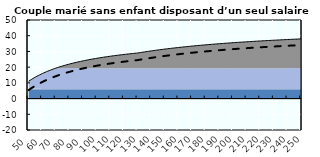
| Category | Coin fiscal moyen (somme des composantes) | Taux moyen d'imposition net en % du salaire brut |
|---|---|---|
| 50.0 | 11.048 | 5.4 |
| 51.0 | 11.62 | 6.008 |
| 52.0 | 12.17 | 6.593 |
| 53.0 | 12.7 | 7.156 |
| 54.0 | 13.209 | 7.698 |
| 55.0 | 13.701 | 8.221 |
| 56.0 | 14.174 | 8.724 |
| 57.0 | 14.631 | 9.211 |
| 58.0 | 15.073 | 9.68 |
| 59.0 | 15.499 | 10.133 |
| 60.0 | 15.911 | 10.572 |
| 61.0 | 16.31 | 10.996 |
| 62.0 | 16.696 | 11.406 |
| 63.0 | 17.069 | 11.803 |
| 64.0 | 17.431 | 12.188 |
| 65.0 | 17.782 | 12.561 |
| 66.0 | 18.122 | 12.923 |
| 67.0 | 18.452 | 13.273 |
| 68.0 | 18.772 | 13.614 |
| 69.0 | 19.083 | 13.945 |
| 70.0 | 19.385 | 14.266 |
| 71.0 | 19.679 | 14.578 |
| 72.0 | 19.964 | 14.882 |
| 73.0 | 20.242 | 15.177 |
| 74.0 | 20.512 | 15.464 |
| 75.0 | 20.775 | 15.744 |
| 76.0 | 21.03 | 16.016 |
| 77.0 | 21.28 | 16.281 |
| 78.0 | 21.523 | 16.539 |
| 79.0 | 21.759 | 16.791 |
| 80.0 | 21.99 | 17.037 |
| 81.0 | 22.215 | 17.276 |
| 82.0 | 22.435 | 17.51 |
| 83.0 | 22.65 | 17.738 |
| 84.0 | 22.859 | 17.96 |
| 85.0 | 23.063 | 18.178 |
| 86.0 | 23.263 | 18.39 |
| 87.0 | 23.458 | 18.597 |
| 88.0 | 23.648 | 18.8 |
| 89.0 | 23.835 | 18.998 |
| 90.0 | 24.017 | 19.192 |
| 91.0 | 24.195 | 19.381 |
| 92.0 | 24.369 | 19.567 |
| 93.0 | 24.54 | 19.748 |
| 94.0 | 24.707 | 19.925 |
| 95.0 | 24.87 | 20.099 |
| 96.0 | 25.03 | 20.269 |
| 97.0 | 25.187 | 20.436 |
| 98.0 | 25.34 | 20.599 |
| 99.0 | 25.49 | 20.759 |
| 100.0 | 25.638 | 20.916 |
| 101.0 | 25.782 | 21.069 |
| 102.0 | 25.924 | 21.22 |
| 103.0 | 26.063 | 21.368 |
| 104.0 | 26.199 | 21.513 |
| 105.0 | 26.333 | 21.655 |
| 106.0 | 26.464 | 21.794 |
| 107.0 | 26.592 | 21.931 |
| 108.0 | 26.719 | 22.065 |
| 109.0 | 26.842 | 22.197 |
| 110.0 | 26.964 | 22.326 |
| 111.0 | 27.084 | 22.453 |
| 112.0 | 27.201 | 22.578 |
| 113.0 | 27.316 | 22.701 |
| 114.0 | 27.43 | 22.821 |
| 115.0 | 27.541 | 22.94 |
| 116.0 | 27.65 | 23.056 |
| 117.0 | 27.758 | 23.17 |
| 118.0 | 27.863 | 23.283 |
| 119.0 | 27.967 | 23.393 |
| 120.0 | 28.069 | 23.502 |
| 121.0 | 28.17 | 23.609 |
| 122.0 | 28.269 | 23.714 |
| 123.0 | 28.366 | 23.817 |
| 124.0 | 28.462 | 23.919 |
| 125.0 | 28.556 | 24.019 |
| 126.0 | 28.648 | 24.118 |
| 127.0 | 28.74 | 24.215 |
| 128.0 | 28.829 | 24.31 |
| 129.0 | 28.918 | 24.404 |
| 130.0 | 29.005 | 24.496 |
| 131.0 | 29.147 | 24.648 |
| 132.0 | 29.288 | 24.797 |
| 133.0 | 29.426 | 24.945 |
| 134.0 | 29.563 | 25.09 |
| 135.0 | 29.697 | 25.233 |
| 136.0 | 29.83 | 25.374 |
| 137.0 | 29.96 | 25.513 |
| 138.0 | 30.089 | 25.65 |
| 139.0 | 30.216 | 25.785 |
| 140.0 | 30.341 | 25.918 |
| 141.0 | 30.464 | 26.049 |
| 142.0 | 30.586 | 26.178 |
| 143.0 | 30.705 | 26.305 |
| 144.0 | 30.824 | 26.431 |
| 145.0 | 30.94 | 26.555 |
| 146.0 | 31.055 | 26.677 |
| 147.0 | 31.168 | 26.798 |
| 148.0 | 31.28 | 26.917 |
| 149.0 | 31.391 | 27.034 |
| 150.0 | 31.499 | 27.15 |
| 151.0 | 31.607 | 27.264 |
| 152.0 | 31.713 | 27.377 |
| 153.0 | 31.818 | 27.488 |
| 154.0 | 31.921 | 27.598 |
| 155.0 | 32.023 | 27.706 |
| 156.0 | 32.123 | 27.813 |
| 157.0 | 32.223 | 27.919 |
| 158.0 | 32.321 | 28.023 |
| 159.0 | 32.418 | 28.126 |
| 160.0 | 32.513 | 28.228 |
| 161.0 | 32.608 | 28.328 |
| 162.0 | 32.701 | 28.427 |
| 163.0 | 32.793 | 28.525 |
| 164.0 | 32.884 | 28.622 |
| 165.0 | 32.974 | 28.718 |
| 166.0 | 33.063 | 28.812 |
| 167.0 | 33.151 | 28.906 |
| 168.0 | 33.237 | 28.998 |
| 169.0 | 33.323 | 29.089 |
| 170.0 | 33.408 | 29.179 |
| 171.0 | 33.491 | 29.268 |
| 172.0 | 33.574 | 29.356 |
| 173.0 | 33.656 | 29.443 |
| 174.0 | 33.737 | 29.529 |
| 175.0 | 33.817 | 29.614 |
| 176.0 | 33.896 | 29.698 |
| 177.0 | 33.974 | 29.781 |
| 178.0 | 34.051 | 29.863 |
| 179.0 | 34.127 | 29.944 |
| 180.0 | 34.203 | 30.025 |
| 181.0 | 34.278 | 30.104 |
| 182.0 | 34.351 | 30.183 |
| 183.0 | 34.424 | 30.26 |
| 184.0 | 34.497 | 30.337 |
| 185.0 | 34.568 | 30.413 |
| 186.0 | 34.639 | 30.488 |
| 187.0 | 34.709 | 30.563 |
| 188.0 | 34.778 | 30.636 |
| 189.0 | 34.847 | 30.709 |
| 190.0 | 34.914 | 30.781 |
| 191.0 | 34.981 | 30.853 |
| 192.0 | 35.048 | 30.923 |
| 193.0 | 35.113 | 30.993 |
| 194.0 | 35.178 | 31.062 |
| 195.0 | 35.243 | 31.131 |
| 196.0 | 35.306 | 31.198 |
| 197.0 | 35.369 | 31.265 |
| 198.0 | 35.432 | 31.332 |
| 199.0 | 35.493 | 31.397 |
| 200.0 | 35.555 | 31.462 |
| 201.0 | 35.615 | 31.527 |
| 202.0 | 35.675 | 31.59 |
| 203.0 | 35.734 | 31.653 |
| 204.0 | 35.793 | 31.716 |
| 205.0 | 35.851 | 31.778 |
| 206.0 | 35.909 | 31.839 |
| 207.0 | 35.966 | 31.9 |
| 208.0 | 36.022 | 31.96 |
| 209.0 | 36.078 | 32.019 |
| 210.0 | 36.134 | 32.078 |
| 211.0 | 36.189 | 32.137 |
| 212.0 | 36.243 | 32.195 |
| 213.0 | 36.297 | 32.252 |
| 214.0 | 36.35 | 32.309 |
| 215.0 | 36.403 | 32.365 |
| 216.0 | 36.456 | 32.421 |
| 217.0 | 36.508 | 32.476 |
| 218.0 | 36.559 | 32.531 |
| 219.0 | 36.61 | 32.585 |
| 220.0 | 36.66 | 32.638 |
| 221.0 | 36.711 | 32.692 |
| 222.0 | 36.76 | 32.744 |
| 223.0 | 36.809 | 32.797 |
| 224.0 | 36.858 | 32.848 |
| 225.0 | 36.906 | 32.9 |
| 226.0 | 36.954 | 32.951 |
| 227.0 | 37.002 | 33.001 |
| 228.0 | 37.049 | 33.051 |
| 229.0 | 37.095 | 33.101 |
| 230.0 | 37.141 | 33.15 |
| 231.0 | 37.187 | 33.198 |
| 232.0 | 37.233 | 33.247 |
| 233.0 | 37.278 | 33.295 |
| 234.0 | 37.322 | 33.342 |
| 235.0 | 37.366 | 33.389 |
| 236.0 | 37.41 | 33.436 |
| 237.0 | 37.454 | 33.482 |
| 238.0 | 37.497 | 33.528 |
| 239.0 | 37.54 | 33.573 |
| 240.0 | 37.582 | 33.619 |
| 241.0 | 37.624 | 33.663 |
| 242.0 | 37.666 | 33.708 |
| 243.0 | 37.707 | 33.752 |
| 244.0 | 37.748 | 33.795 |
| 245.0 | 37.789 | 33.839 |
| 246.0 | 37.829 | 33.882 |
| 247.0 | 37.869 | 33.924 |
| 248.0 | 37.909 | 33.966 |
| 249.0 | 37.949 | 34.008 |
| 250.0 | 37.988 | 34.05 |